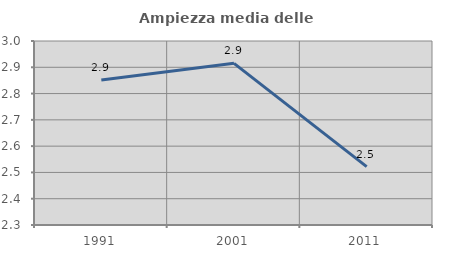
| Category | Ampiezza media delle famiglie |
|---|---|
| 1991.0 | 2.852 |
| 2001.0 | 2.915 |
| 2011.0 | 2.522 |